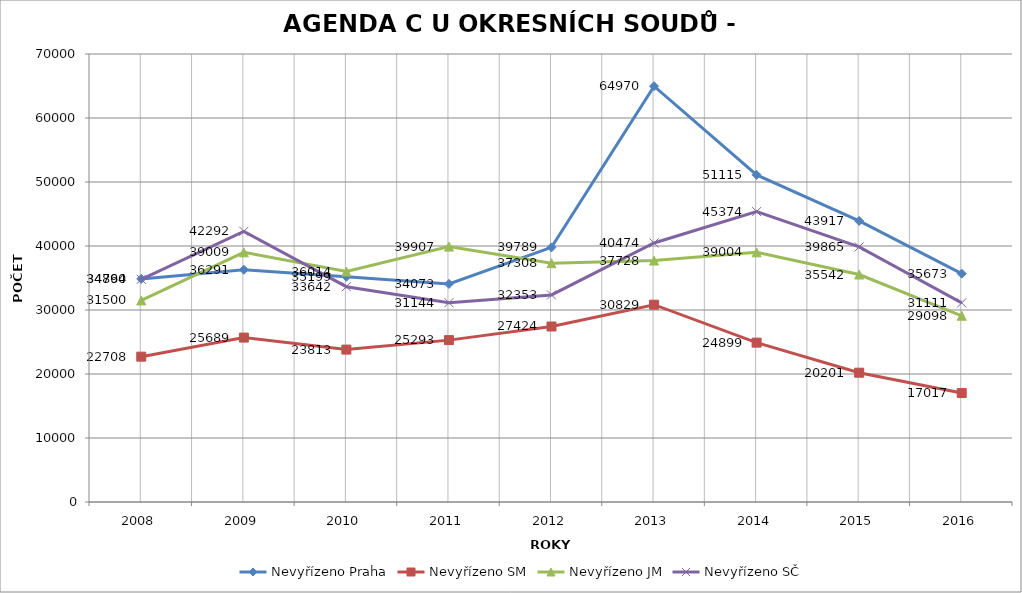
| Category | Nevyřízeno Praha | Nevyřízeno SM | Nevyřízeno JM | Nevyřízeno SČ |
|---|---|---|---|---|
| 2008.0 | 34860 | 22708 | 31500 | 34794 |
| 2009.0 | 36291 | 25689 | 39009 | 42292 |
| 2010.0 | 35199 | 23813 | 36014 | 33642 |
| 2011.0 | 34073 | 25293 | 39907 | 31144 |
| 2012.0 | 39789 | 27424 | 37308 | 32353 |
| 2013.0 | 64970 | 30829 | 37728 | 40474 |
| 2014.0 | 51115 | 24899 | 39004 | 45374 |
| 2015.0 | 43917 | 20201 | 35542 | 39865 |
| 2016.0 | 35673 | 17017 | 29098 | 31111 |